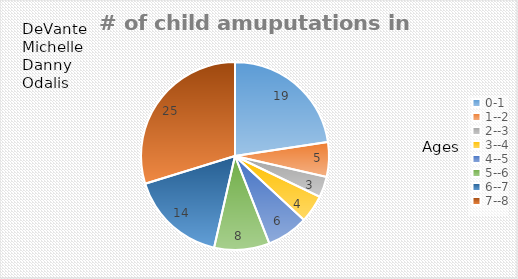
| Category | # of amuputations |
|---|---|
| 0-1 | 19 |
| 1--2 | 5 |
| 2--3 | 3 |
| 3--4 | 4 |
| 4--5 | 6 |
| 5--6 | 8 |
| 6--7 | 14 |
| 7--8 | 25 |